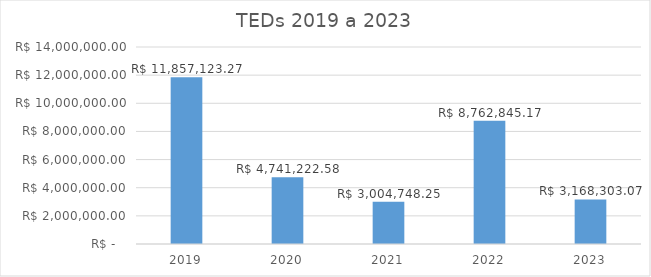
| Category | TEDs 2019 a 2023 |
|---|---|
| 2019.0 | 11857123.27 |
| 2020.0 | 4741222.58 |
| 2021.0 | 3004748.25 |
| 2022.0 | 8762845.17 |
| 2023.0 | 3168303.07 |